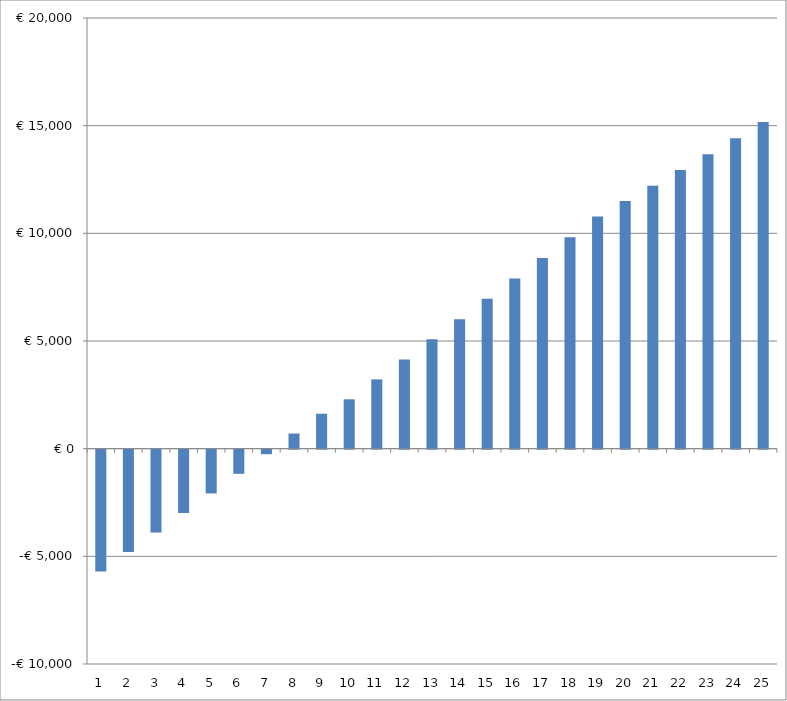
| Category | Series 0 |
|---|---|
| 0 | -37299.075 |
| 1 | -31309.445 |
| 2 | -25273.451 |
| 3 | -19188.751 |
| 4 | -13052.94 |
| 5 | -6863.547 |
| 6 | -618.035 |
| 7 | 5686.205 |
| 8 | 12051.853 |
| 9 | 18231.662 |
| 10 | 24728.462 |
| 11 | 30833.583 |
| 12 | 36286.256 |
| 13 | 41814.896 |
| 14 | 47422.664 |
| 15 | 53112.811 |
| 16 | 58888.679 |
| 17 | 64753.707 |
| 18 | 70711.432 |
| 19 | 76515.489 |
| 20 | 81178.142 |
| 21 | 85958.141 |
| 22 | 90859.327 |
| 23 | 95885.653 |
| 24 | 101041.192 |